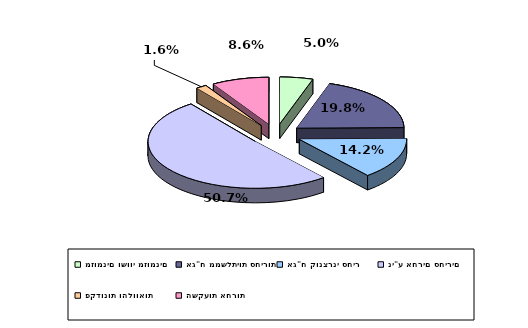
| Category | Series 0 |
|---|---|
| מזומנים ושווי מזומנים | 0.05 |
| אג"ח ממשלתיות סחירות | 0.198 |
| אג"ח קונצרני סחיר | 0.142 |
| ני"ע אחרים סחירים | 0.507 |
| פקדונות והלוואות | 0.016 |
| השקעות אחרות | 0.086 |